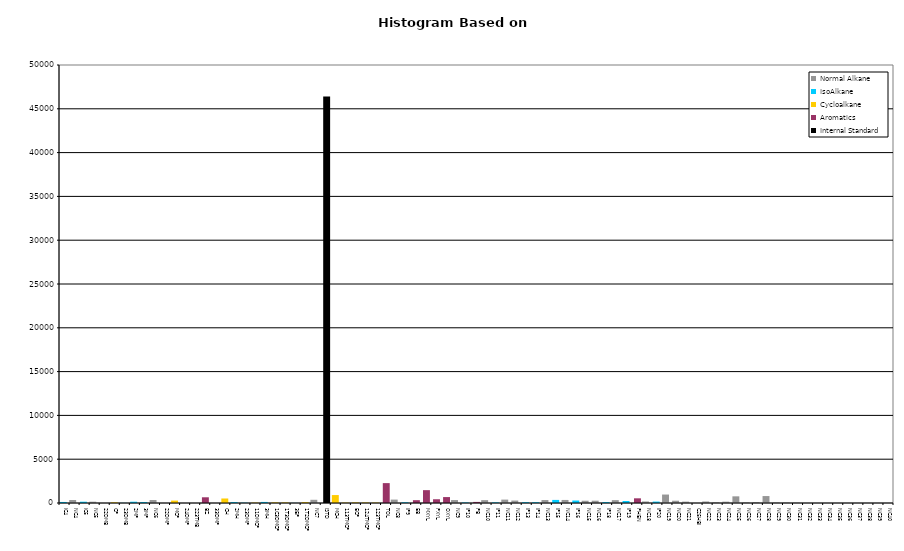
| Category | Normal Alkane | IsoAlkane | Cycloalkane | Aromatics | Internal Standard |
|---|---|---|---|---|---|
| IC4 | 0 | 118 | 0 | 0 | 0 |
| NC4 | 341 | 0 | 0 | 0 | 0 |
| IC5 | 0 | 147 | 0 | 0 | 0 |
| NC5 | 148 | 0 | 0 | 0 | 0 |
| 22DMB | 0 | 0 | 0 | 0 | 0 |
| CP | 0 | 0 | 76 | 0 | 0 |
| 23DMB | 0 | 16 | 0 | 0 | 0 |
| 2MP | 0 | 146 | 0 | 0 | 0 |
| 3MP | 0 | 108 | 0 | 0 | 0 |
| NC6 | 342 | 0 | 0 | 0 | 0 |
| 22DMP | 0 | 0 | 0 | 0 | 0 |
| MCP | 0 | 0 | 276 | 0 | 0 |
| 24DMP | 0 | 0 | 0 | 0 | 0 |
| 223TMB | 0 | 0 | 0 | 0 | 0 |
| BZ | 0 | 0 | 0 | 652 | 0 |
| 33DMP | 0 | 0 | 0 | 0 | 0 |
| CH | 0 | 0 | 515 | 0 | 0 |
| 2MH | 0 | 105 | 0 | 0 | 0 |
| 23DMP | 0 | 36 | 0 | 0 | 0 |
| 11DMCP | 0 | 0 | 44 | 0 | 0 |
| 3MH | 0 | 122 | 0 | 0 | 0 |
| 1C3DMCP | 0 | 0 | 72 | 0 | 0 |
| 1T3DMCP | 0 | 0 | 64 | 0 | 0 |
| 3EP | 0 | 11 | 0 | 0 | 0 |
| 1T2DMCP | 0 | 0 | 100 | 0 | 0 |
| NC7 | 365 | 0 | 0 | 0 | 0 |
| ISTD | 0 | 0 | 0 | 0 | 46391 |
| MCH | 0 | 0 | 907 | 0 | 0 |
| 113TMCP | 0 | 0 | 46 | 0 | 0 |
| ECP | 0 | 0 | 71 | 0 | 0 |
| 124TMCP | 0 | 0 | 60 | 0 | 0 |
| 123TMCP | 0 | 0 | 46 | 0 | 0 |
| TOL | 0 | 0 | 0 | 2270 | 0 |
| NC8 | 387 | 0 | 0 | 0 | 0 |
| IP9 | 0 | 83 | 0 | 0 | 0 |
| EB | 0 | 0 | 0 | 322 | 0 |
| MXYL | 0 | 0 | 0 | 1467 | 0 |
| PXYL | 0 | 0 | 0 | 428 | 0 |
| OXYL | 0 | 0 | 0 | 676 | 0 |
| NC9 | 337 | 0 | 0 | 0 | 0 |
| IP10 | 0 | 62 | 0 | 0 | 0 |
| PB | 0 | 0 | 0 | 124 | 0 |
| NC10 | 327 | 0 | 0 | 0 | 0 |
| IP11 | 0 | 71 | 0 | 0 | 0 |
| NC11 | 386 | 0 | 0 | 0 | 0 |
| NC12 | 281 | 0 | 0 | 0 | 0 |
| IP13 | 0 | 93 | 0 | 0 | 0 |
| IP14 | 0 | 89 | 0 | 0 | 0 |
| NC13 | 337 | 0 | 0 | 0 | 0 |
| IP15 | 0 | 352 | 0 | 0 | 0 |
| NC14 | 347 | 0 | 0 | 0 | 0 |
| IP16 | 0 | 284 | 0 | 0 | 0 |
| NC15 | 258 | 0 | 0 | 0 | 0 |
| NC16 | 263 | 0 | 0 | 0 | 0 |
| IP18 | 0 | 104 | 0 | 0 | 0 |
| NC17 | 326 | 0 | 0 | 0 | 0 |
| IP19 | 0 | 230 | 0 | 0 | 0 |
| PHEN | 0 | 0 | 0 | 535 | 0 |
| NC18 | 175 | 0 | 0 | 0 | 0 |
| IP20 | 0 | 163 | 0 | 0 | 0 |
| NC19 | 966 | 0 | 0 | 0 | 0 |
| NC20 | 261 | 0 | 0 | 0 | 0 |
| NC21 | 158 | 0 | 0 | 0 | 0 |
| C25HBI | 0 | 0 | 0 | 0 | 0 |
| NC22 | 174 | 0 | 0 | 0 | 0 |
| NC23 | 81 | 0 | 0 | 0 | 0 |
| NC24 | 152 | 0 | 0 | 0 | 0 |
| NC25 | 761 | 0 | 0 | 0 | 0 |
| NC26 | 73 | 0 | 0 | 0 | 0 |
| NC27 | 107 | 0 | 0 | 0 | 0 |
| NC28 | 793 | 0 | 0 | 0 | 0 |
| NC29 | 54 | 0 | 0 | 0 | 0 |
| NC30 | 48 | 0 | 0 | 0 | 0 |
| NC31 | 38 | 0 | 0 | 0 | 0 |
| NC32 | 0 | 0 | 0 | 0 | 0 |
| NC33 | 0 | 0 | 0 | 0 | 0 |
| NC34 | 0 | 0 | 0 | 0 | 0 |
| NC35 | 0 | 0 | 0 | 0 | 0 |
| NC36 | 0 | 0 | 0 | 0 | 0 |
| NC37 | 0 | 0 | 0 | 0 | 0 |
| NC38 | 0 | 0 | 0 | 0 | 0 |
| NC39 | 0 | 0 | 0 | 0 | 0 |
| NC40 | 0 | 0 | 0 | 0 | 0 |